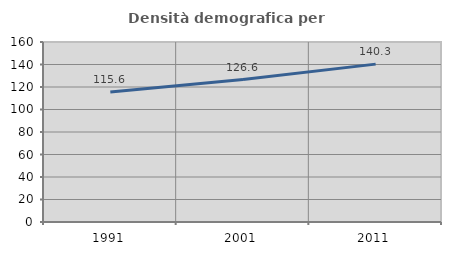
| Category | Densità demografica |
|---|---|
| 1991.0 | 115.602 |
| 2001.0 | 126.597 |
| 2011.0 | 140.325 |